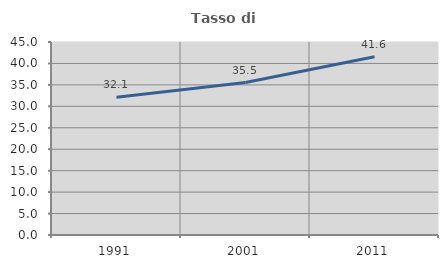
| Category | Tasso di occupazione   |
|---|---|
| 1991.0 | 32.118 |
| 2001.0 | 35.542 |
| 2011.0 | 41.575 |